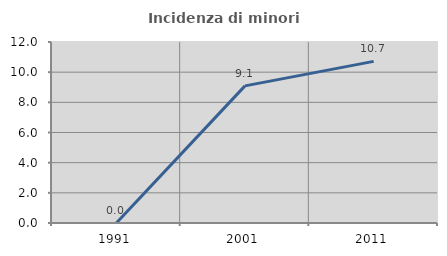
| Category | Incidenza di minori stranieri |
|---|---|
| 1991.0 | 0 |
| 2001.0 | 9.091 |
| 2011.0 | 10.714 |